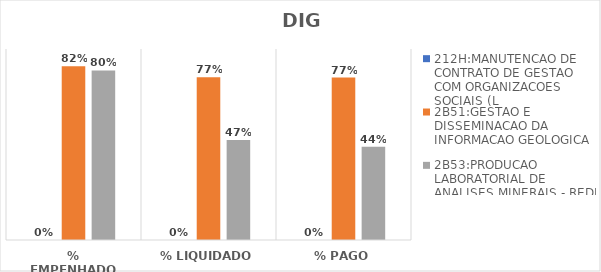
| Category | 212H:MANUTENCAO DE CONTRATO DE GESTAO COM ORGANIZACOES SOCIAIS (L | 2B51:GESTAO E DISSEMINACAO DA INFORMACAO GEOLOGICA | 2B53:PRODUCAO LABORATORIAL DE ANALISES MINERAIS - REDE LAMIN |
|---|---|---|---|
| % EMPENHADO | 0 | 0.818 | 0.799 |
| % LIQUIDADO | 0 | 0.767 | 0.472 |
| % PAGO | 0 | 0.765 | 0.44 |